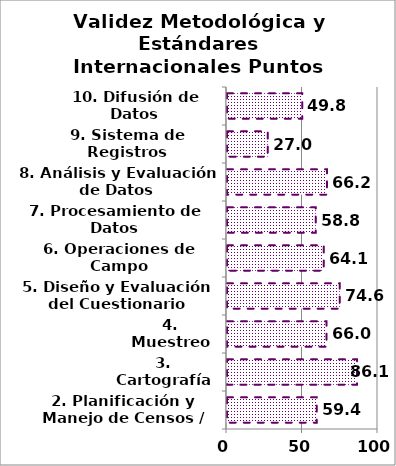
| Category | Series 0 |
|---|---|
| 2. Planificación y Manejo de Censos / Encuestas | 59.408 |
| 3. Cartografía | 86.111 |
| 4. Muestreo | 65.952 |
| 5. Diseño y Evaluación del Cuestionario | 74.616 |
| 6. Operaciones de Campo | 64.126 |
| 7. Procesamiento de Datos | 58.779 |
| 8. Análisis y Evaluación de Datos | 66.195 |
| 9. Sistema de Registros Administrativos | 26.984 |
| 10. Difusión de Datos | 49.815 |